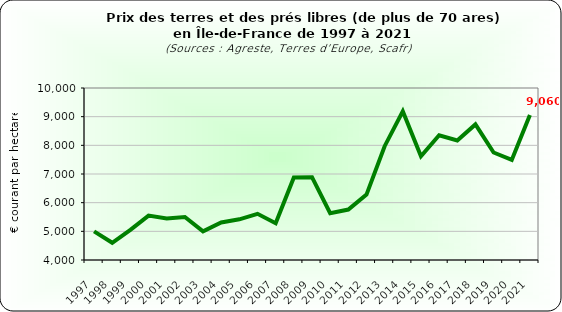
| Category | Series 1 |
|---|---|
| 1997.0 | 5000 |
| 1998.0 | 4600 |
| 1999.0 | 5050 |
| 2000.0 | 5550 |
| 2001.0 | 5450 |
| 2002.0 | 5500 |
| 2003.0 | 5000 |
| 2004.0 | 5310 |
| 2005.0 | 5420 |
| 2006.0 | 5610 |
| 2007.0 | 5280 |
| 2008.0 | 6880 |
| 2009.0 | 6890 |
| 2010.0 | 5630 |
| 2011.0 | 5760 |
| 2012.0 | 6280 |
| 2013.0 | 7970 |
| 2014.0 | 9190 |
| 2015.0 | 7620 |
| 2016.0 | 8350 |
| 2017.0 | 8170 |
| 2018.0 | 8730 |
| 2019.0 | 7750 |
| 2020.0 | 7490 |
| 2021.0 | 9060 |